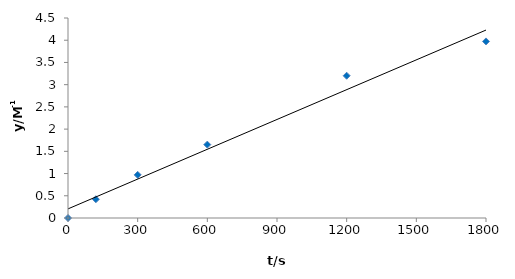
| Category | Series 0 |
|---|---|
| 0.0 | 0 |
| 120.0 | 0.422 |
| 300.0 | 0.971 |
| 600.0 | 1.651 |
| 1200.0 | 3.201 |
| 1800.0 | 3.973 |